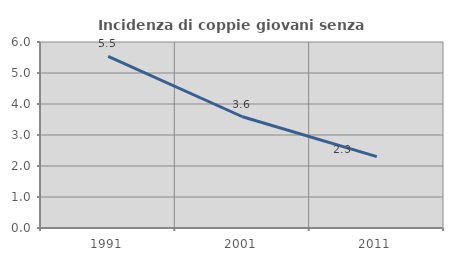
| Category | Incidenza di coppie giovani senza figli |
|---|---|
| 1991.0 | 5.535 |
| 2001.0 | 3.589 |
| 2011.0 | 2.303 |